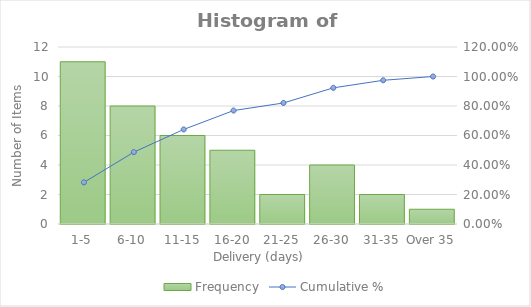
| Category | Frequency |
|---|---|
| 0 | 11 |
| 1 | 8 |
| 2 | 6 |
| 3 | 5 |
| 4 | 2 |
| 5 | 4 |
| 6 | 2 |
| 7 | 1 |